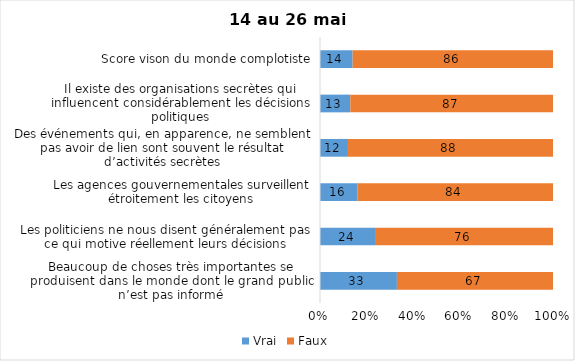
| Category | Vrai | Faux |
|---|---|---|
| Beaucoup de choses très importantes se produisent dans le monde dont le grand public n’est pas informé | 33 | 67 |
| Les politiciens ne nous disent généralement pas ce qui motive réellement leurs décisions | 24 | 76 |
| Les agences gouvernementales surveillent étroitement les citoyens | 16 | 84 |
| Des événements qui, en apparence, ne semblent pas avoir de lien sont souvent le résultat d’activités secrètes | 12 | 88 |
| Il existe des organisations secrètes qui influencent considérablement les décisions politiques | 13 | 87 |
| Score vison du monde complotiste | 14 | 86 |